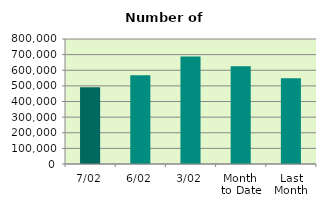
| Category | Series 0 |
|---|---|
| 7/02 | 491844 |
| 6/02 | 568370 |
| 3/02 | 688106 |
| Month 
to Date | 625823.2 |
| Last
Month | 549126.273 |